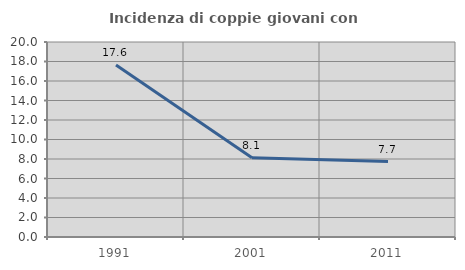
| Category | Incidenza di coppie giovani con figli |
|---|---|
| 1991.0 | 17.64 |
| 2001.0 | 8.124 |
| 2011.0 | 7.743 |